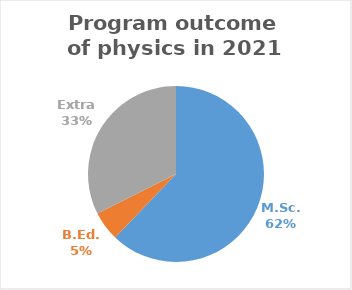
| Category | Series 0 |
|---|---|
| M.Sc. | 23 |
| B.Ed. | 2 |
| Extra | 12 |